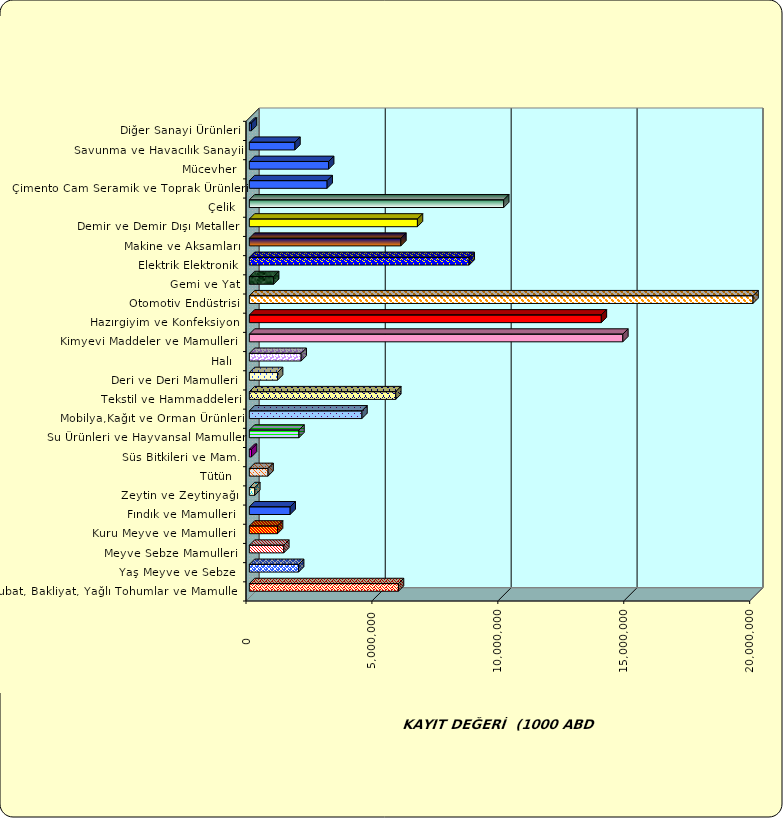
| Category | Series 0 |
|---|---|
|  Hububat, Bakliyat, Yağlı Tohumlar ve Mamulleri  | 5921012.036 |
|  Yaş Meyve ve Sebze   | 1955464.774 |
|  Meyve Sebze Mamulleri  | 1367867.115 |
|  Kuru Meyve ve Mamulleri   | 1119355.65 |
|  Fındık ve Mamulleri  | 1621449.127 |
|  Zeytin ve Zeytinyağı  | 215855.8 |
|  Tütün  | 742694.561 |
|  Süs Bitkileri ve Mam. | 84059.733 |
|  Su Ürünleri ve Hayvansal Mamuller | 1969508.617 |
|  Mobilya,Kağıt ve Orman Ürünleri | 4471051.549 |
|  Tekstil ve Hammaddeleri | 5814006.199 |
|  Deri ve Deri Mamulleri  | 1119621.183 |
|  Halı  | 2057552.968 |
|  Kimyevi Maddeler ve Mamulleri   | 14829933.673 |
|  Hazırgiyim ve Konfeksiyon  | 13976634.479 |
|  Otomotiv Endüstrisi | 20055838.864 |
|  Gemi ve Yat | 963627.064 |
|  Elektrik Elektronik | 8730085.052 |
|  Makine ve Aksamları | 6016462.698 |
|  Demir ve Demir Dışı Metaller  | 6674578.382 |
|  Çelik | 10101062.626 |
|  Çimento Cam Seramik ve Toprak Ürünleri | 3088521.539 |
|  Mücevher | 3147498.288 |
|  Savunma ve Havacılık Sanayii | 1809278.501 |
|  Diğer Sanayi Ürünleri | 81248.748 |